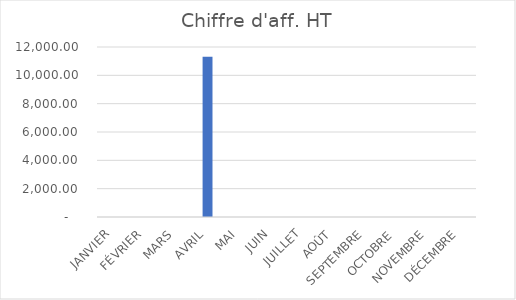
| Category | Chiffre d'aff. HT |
|---|---|
| JANVIER | 0 |
| FÉVRIER | 0 |
| MARS | 0 |
| AVRIL | 11312 |
| MAI | 0 |
| JUIN | 0 |
| JUILLET | 0 |
| AOÛT | 0 |
| SEPTEMBRE | 0 |
| OCTOBRE | 0 |
| NOVEMBRE | 0 |
| DÉCEMBRE | 0 |